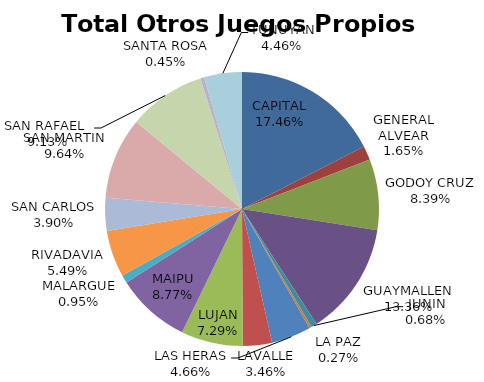
| Category | Total Otros Juegos Propios Beneficio |
|---|---|
| CAPITAL | 172173.85 |
| GENERAL ALVEAR | 16239.63 |
| GODOY CRUZ | 82710.67 |
| GUAYMALLEN | 131741.13 |
| JUNIN | 6688.86 |
| LA PAZ | 2696.6 |
| LAS HERAS | 45993.52 |
| LAVALLE | 34080.27 |
| LUJAN | 71847.42 |
| MAIPU | 86534.08 |
| MALARGUE | 9321.89 |
| RIVADAVIA | 54138.74 |
| SAN CARLOS | 38452.85 |
| SAN MARTIN | 95076.79 |
| SAN RAFAEL  | 90087.6 |
| SANTA ROSA | 4392.2 |
| TUNUYAN | 43983.97 |